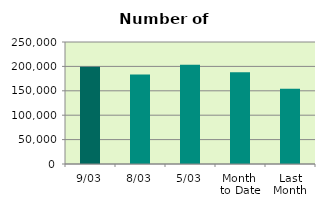
| Category | Series 0 |
|---|---|
| 9/03 | 199286 |
| 8/03 | 183652 |
| 5/03 | 203274 |
| Month 
to Date | 187959.143 |
| Last
Month | 154356.5 |